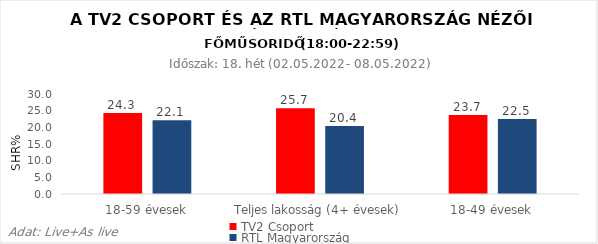
| Category | TV2 Csoport | RTL Magyarország |
|---|---|---|
| 18-59 évesek | 24.3 | 22.1 |
| Teljes lakosság (4+ évesek) | 25.7 | 20.4 |
| 18-49 évesek | 23.7 | 22.5 |